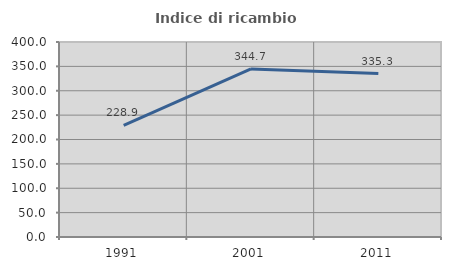
| Category | Indice di ricambio occupazionale  |
|---|---|
| 1991.0 | 228.889 |
| 2001.0 | 344.737 |
| 2011.0 | 335.294 |